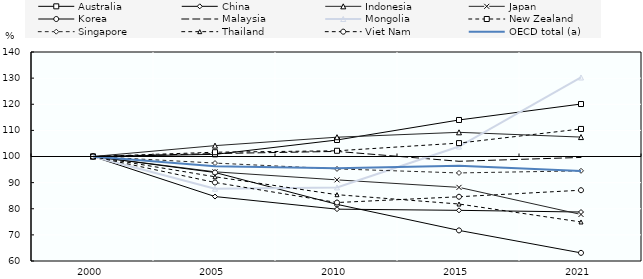
| Category | Australia | China | Indonesia | Japan | Korea | Malaysia | Mongolia | New Zealand | Singapore | Thailand | Viet Nam | OECD total (a) |
|---|---|---|---|---|---|---|---|---|---|---|---|---|
| 2000.0 | 100 | 100 | 100 | 100 | 100 | 100 | 100 | 100 | 100 | 100 | 100 | 100 |
| 2005.0 | 100.818 | 84.667 | 104.158 | 94.135 | 93.878 | 101.121 | 87.676 | 101.64 | 97.486 | 92.236 | 90.051 | 96.264 |
| 2010.0 | 106.321 | 79.841 | 107.39 | 91.055 | 81.679 | 101.946 | 88.166 | 102.187 | 95.254 | 85.387 | 82.377 | 95.456 |
| 2015.0 | 113.978 | 79.394 | 109.258 | 88.179 | 71.713 | 98.166 | 103.814 | 105.131 | 93.71 | 81.813 | 84.593 | 96.466 |
| 2021.0 | 120.089 | 78.749 | 107.431 | 77.822 | 63.108 | 99.643 | 130.243 | 110.548 | 94.521 | 74.939 | 87.094 | 94.408 |